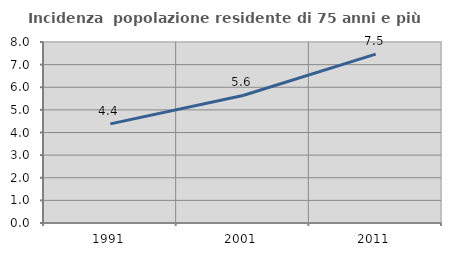
| Category | Incidenza  popolazione residente di 75 anni e più |
|---|---|
| 1991.0 | 4.38 |
| 2001.0 | 5.635 |
| 2011.0 | 7.466 |